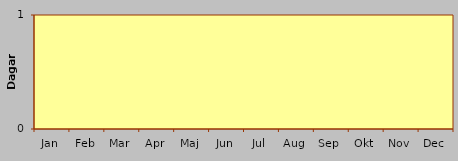
| Category | Semester |
|---|---|
| Jan | 0 |
| Feb | 0 |
| Mar | 0 |
| Apr | 0 |
| Maj | 0 |
| Jun | 0 |
| Jul | 0 |
| Aug | 0 |
| Sep | 0 |
| Okt | 0 |
| Nov | 0 |
| Dec | 0 |